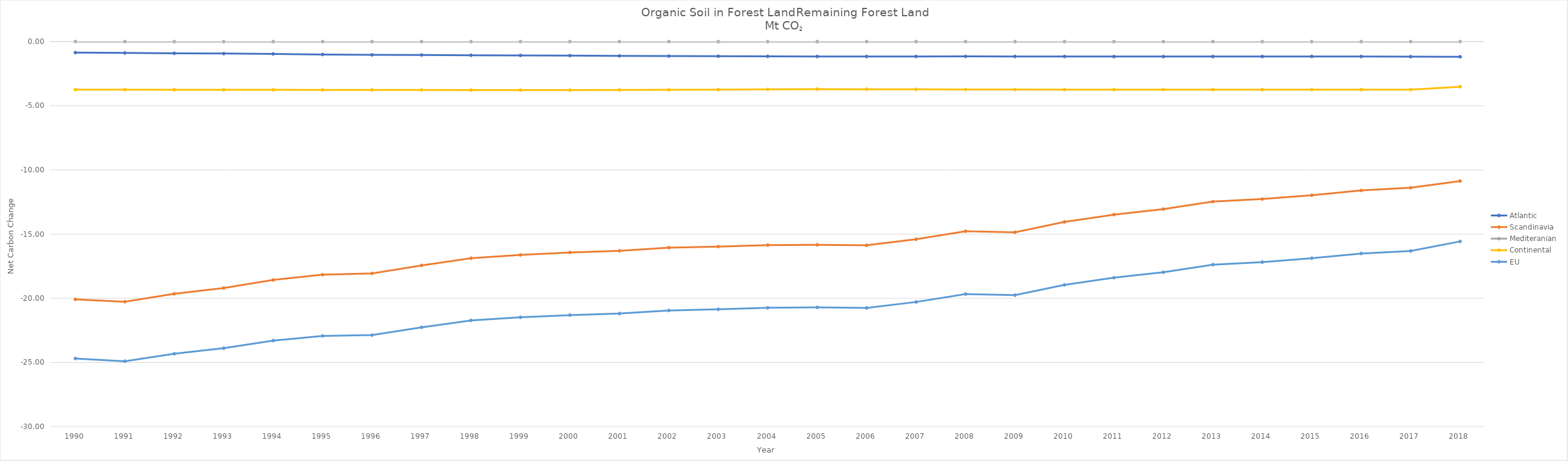
| Category | Atlantic | Scandinavia | Mediteranian | Continental | EU |
|---|---|---|---|---|---|
| 1990 | -0.858 | -20.088 | 0 | -3.744 | -24.691 |
| 1991 | -0.885 | -20.266 | 0 | -3.748 | -24.901 |
| 1992 | -0.912 | -19.653 | 0 | -3.753 | -24.319 |
| 1993 | -0.933 | -19.197 | 0 | -3.756 | -23.888 |
| 1994 | -0.961 | -18.572 | 0 | -3.76 | -23.295 |
| 1995 | -1.005 | -18.161 | 0 | -3.764 | -22.931 |
| 1996 | -1.036 | -18.06 | 0 | -3.768 | -22.865 |
| 1997 | -1.048 | -17.441 | 0 | -3.771 | -22.263 |
| 1998 | -1.063 | -16.881 | 0 | -3.775 | -21.722 |
| 1999 | -1.076 | -16.623 | 0 | -3.779 | -21.48 |
| 2000 | -1.092 | -16.432 | 0 | -3.782 | -21.309 |
| 2001 | -1.114 | -16.3 | 0 | -3.77 | -21.188 |
| 2002 | -1.13 | -16.056 | 0 | -3.757 | -20.947 |
| 2003 | -1.14 | -15.971 | 0 | -3.742 | -20.857 |
| 2004 | -1.151 | -15.859 | 0 | -3.726 | -20.739 |
| 2005 | -1.159 | -15.836 | 0 | -3.707 | -20.706 |
| 2006 | -1.159 | -15.873 | 0 | -3.715 | -20.752 |
| 2007 | -1.158 | -15.399 | 0 | -3.726 | -20.288 |
| 2008 | -1.154 | -14.773 | 0 | -3.736 | -19.667 |
| 2009 | -1.157 | -14.857 | 0 | -3.738 | -19.757 |
| 2010 | -1.161 | -14.049 | 0 | -3.74 | -18.954 |
| 2011 | -1.165 | -13.485 | 0 | -3.742 | -18.397 |
| 2012 | -1.167 | -13.057 | 0 | -3.743 | -17.971 |
| 2013 | -1.163 | -12.469 | 0 | -3.744 | -17.38 |
| 2014 | -1.162 | -12.268 | 0 | -3.744 | -17.179 |
| 2015 | -1.156 | -11.969 | 0 | -3.744 | -16.875 |
| 2016 | -1.163 | -11.597 | 0 | -3.744 | -16.509 |
| 2017 | -1.174 | -11.388 | 0 | -3.746 | -16.314 |
| 2018 | -1.182 | -10.867 | 0 | -3.516 | -15.571 |